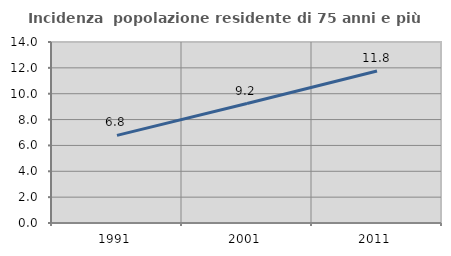
| Category | Incidenza  popolazione residente di 75 anni e più |
|---|---|
| 1991.0 | 6.775 |
| 2001.0 | 9.238 |
| 2011.0 | 11.752 |